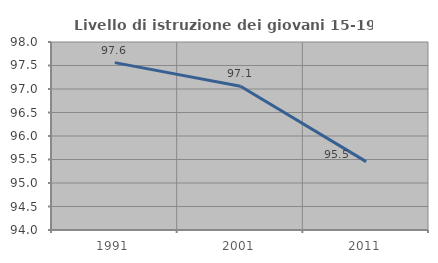
| Category | Livello di istruzione dei giovani 15-19 anni |
|---|---|
| 1991.0 | 97.561 |
| 2001.0 | 97.059 |
| 2011.0 | 95.455 |